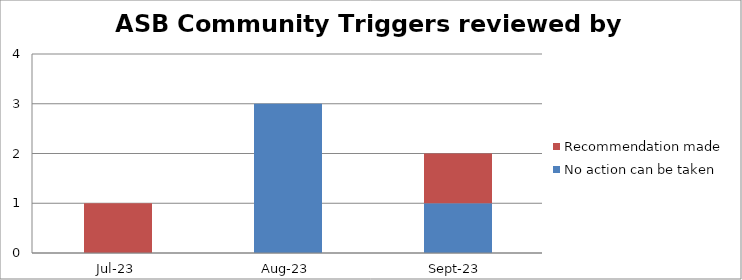
| Category | No action can be taken | Recommendation made |
|---|---|---|
| 2023-07-01 | 0 | 1 |
| 2023-08-01 | 3 | 0 |
| 2023-09-01 | 1 | 1 |